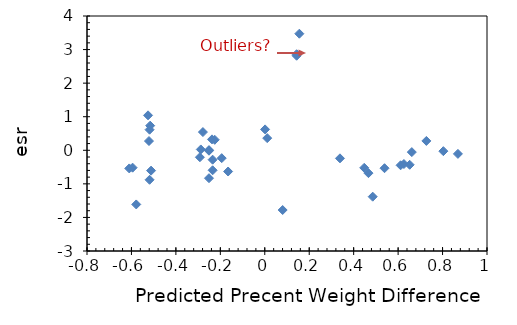
| Category | Series 0 |
|---|---|
| -0.6098147480219875 | -0.54 |
| -0.5948078978884617 | -0.518 |
| -0.5784367886518851 | -1.613 |
| -0.5252306836330156 | 1.041 |
| -0.5211379063238724 | 0.276 |
| -0.5184093881177763 | -0.879 |
| -0.5184093881177763 | 0.614 |
| -0.5156808699116802 | 0.734 |
| -0.5115880926025369 | -0.606 |
| -0.2919423770118197 | -0.207 |
| -0.28784959970267465 | 0.025 |
| -0.2782997859813392 | 0.543 |
| -0.25101460392038 | -0.013 |
| -0.25101460392038 | -0.831 |
| -0.25101460392038 | 0.007 |
| -0.23737201288990128 | 0.325 |
| -0.2346434946838052 | -0.595 |
| -0.2346434946838052 | -0.28 |
| -0.22509368096246796 | 0.312 |
| -0.19371572159236727 | -0.234 |
| -0.16506628042835914 | -0.632 |
| 0.0013733301434886158 | 0.622 |
| 0.010923143864822293 | 0.362 |
| 0.08050035812026834 | -1.78 |
| 0.14325627686047504 | 2.816 |
| 0.14325627686047504 | 2.862 |
| 0.15553460878790482 | 3.473 |
| 0.33834532859632915 | -0.24 |
| 0.4474860568401642 | -0.522 |
| 0.4665856842828351 | -0.681 |
| 0.485685311725506 | -1.382 |
| 0.5388914167443755 | -0.534 |
| 0.6111971492059158 | -0.447 |
| 0.6262039993394435 | -0.409 |
| 0.6521249222973537 | -0.432 |
| 0.661674736018691 | -0.054 |
| 0.7271591729649902 | 0.279 |
| 0.8035576827356756 | -0.026 |
| 0.8690421196819766 | -0.107 |